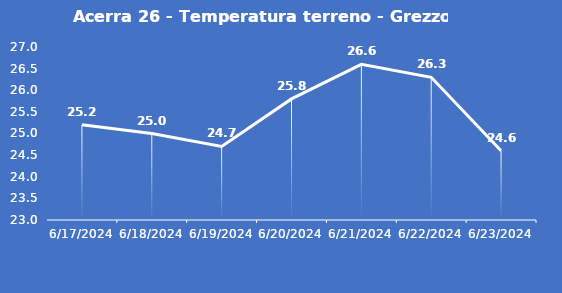
| Category | Acerra 26 - Temperatura terreno - Grezzo (°C) |
|---|---|
| 6/17/24 | 25.2 |
| 6/18/24 | 25 |
| 6/19/24 | 24.7 |
| 6/20/24 | 25.8 |
| 6/21/24 | 26.6 |
| 6/22/24 | 26.3 |
| 6/23/24 | 24.6 |